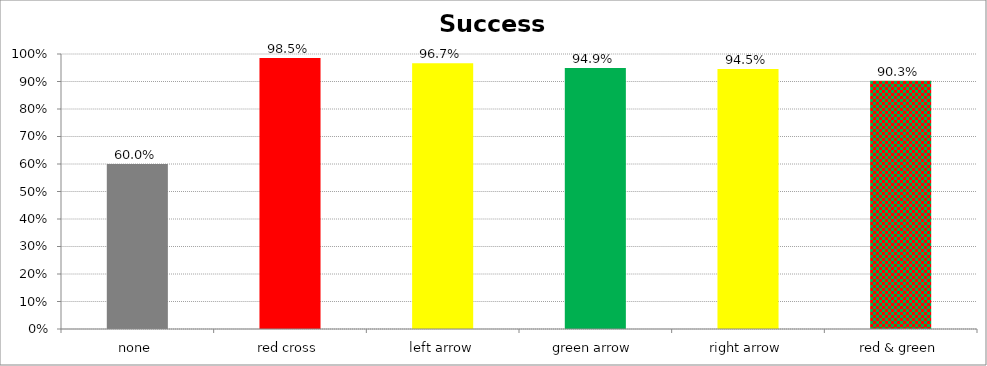
| Category | Success Rate |
|---|---|
| none | 0.6 |
| red cross | 0.985 |
| left arrow | 0.967 |
| green arrow | 0.949 |
| right arrow | 0.945 |
| red & green | 0.903 |